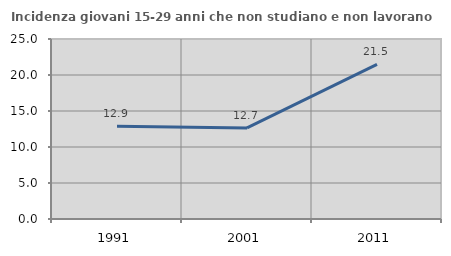
| Category | Incidenza giovani 15-29 anni che non studiano e non lavorano  |
|---|---|
| 1991.0 | 12.875 |
| 2001.0 | 12.651 |
| 2011.0 | 21.484 |